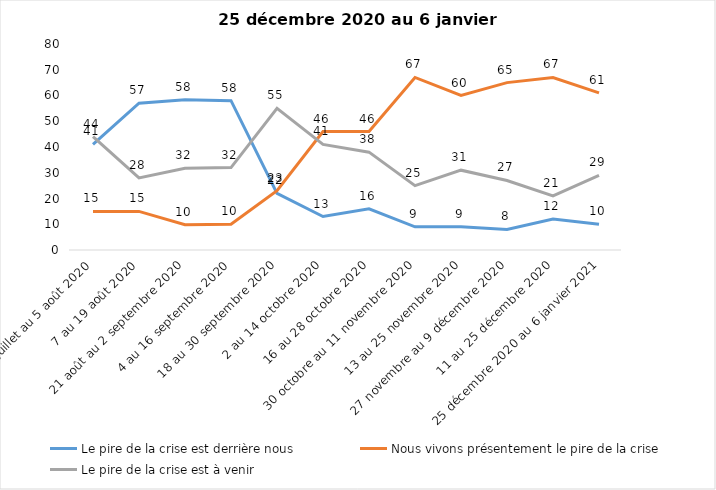
| Category | Le pire de la crise est derrière nous | Nous vivons présentement le pire de la crise | Le pire de la crise est à venir |
|---|---|---|---|
| 24 juillet au 5 août 2020 | 41 | 15 | 44 |
| 7 au 19 août 2020 | 57 | 15 | 28 |
| 21 août au 2 septembre 2020 | 58.39 | 9.84 | 31.77 |
| 4 au 16 septembre 2020 | 58 | 10 | 32 |
| 18 au 30 septembre 2020 | 22 | 23 | 55 |
| 2 au 14 octobre 2020 | 13 | 46 | 41 |
| 16 au 28 octobre 2020 | 16 | 46 | 38 |
| 30 octobre au 11 novembre 2020 | 9 | 67 | 25 |
| 13 au 25 novembre 2020 | 9 | 60 | 31 |
| 27 novembre au 9 décembre 2020 | 8 | 65 | 27 |
| 11 au 25 décembre 2020 | 12 | 67 | 21 |
| 25 décembre 2020 au 6 janvier 2021 | 10 | 61 | 29 |